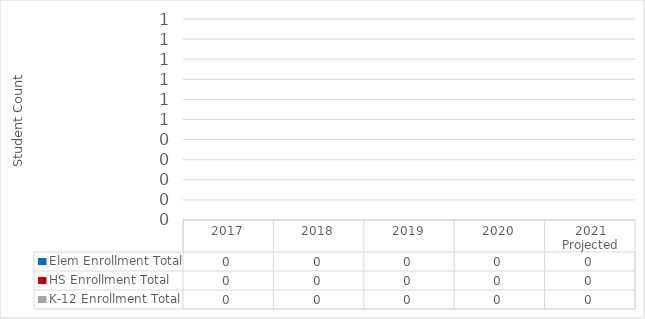
| Category | Elem Enrollment Total | HS Enrollment Total | K-12 Enrollment Total |
|---|---|---|---|
| 2017 | 0 | 0 | 0 |
| 2018 | 0 | 0 | 0 |
| 2019 | 0 | 0 | 0 |
| 2020 | 0 | 0 | 0 |
| 2021 Projected | 0 | 0 | 0 |